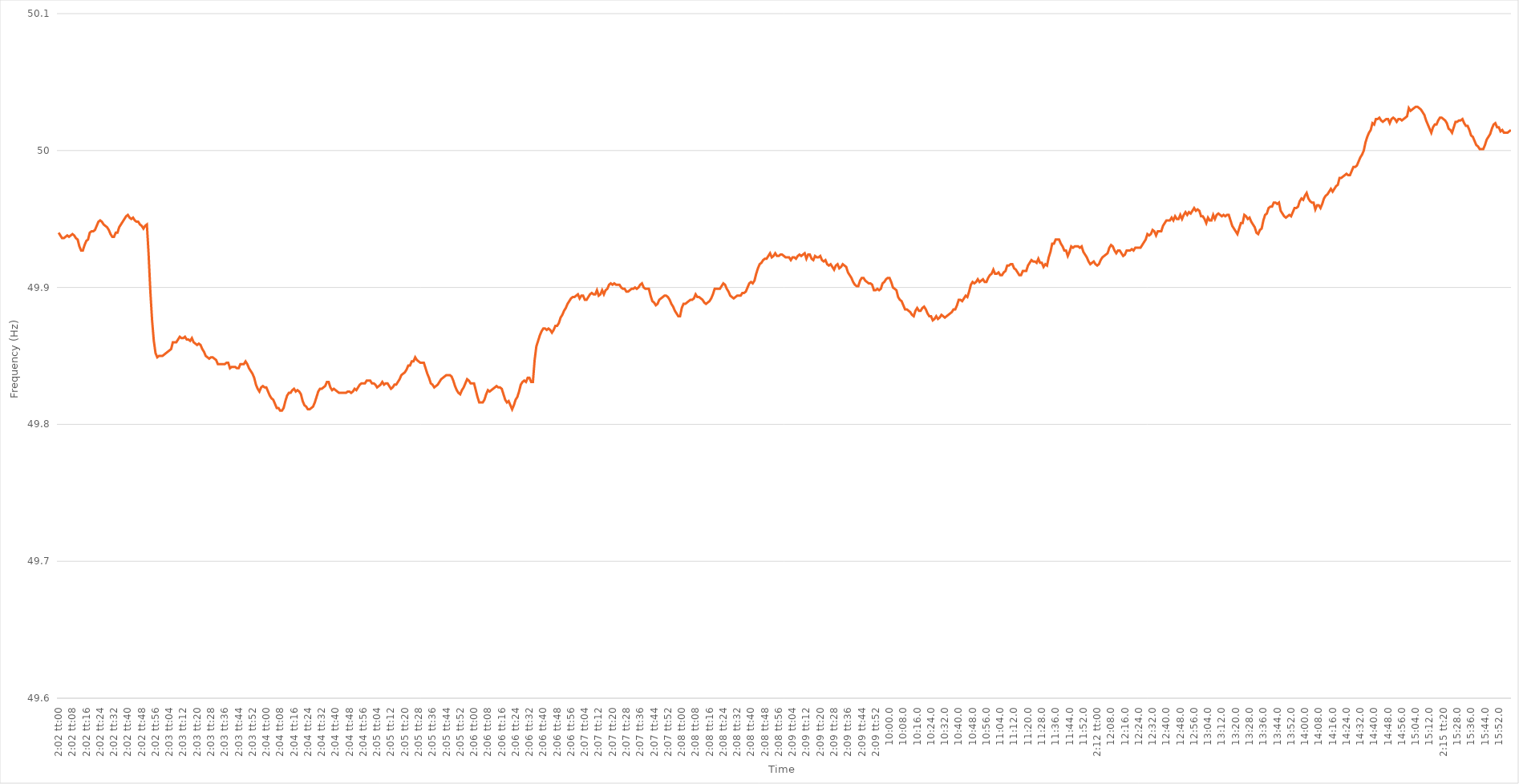
| Category | Series 0 |
|---|---|
| 0.08472222222222221 | 49.94 |
| 0.0847337962962963 | 49.938 |
| 0.08474537037037037 | 49.936 |
| 0.08475694444444444 | 49.936 |
| 0.08476851851851852 | 49.937 |
| 0.0847800925925926 | 49.938 |
| 0.08479166666666667 | 49.937 |
| 0.08480324074074075 | 49.938 |
| 0.0848148148148148 | 49.939 |
| 0.08482638888888888 | 49.938 |
| 0.08483796296296296 | 49.936 |
| 0.08484953703703703 | 49.935 |
| 0.08486111111111111 | 49.93 |
| 0.08487268518518519 | 49.927 |
| 0.08488425925925926 | 49.927 |
| 0.08489583333333334 | 49.931 |
| 0.08490740740740742 | 49.934 |
| 0.08491898148148148 | 49.935 |
| 0.08493055555555555 | 49.94 |
| 0.08494212962962962 | 49.941 |
| 0.0849537037037037 | 49.941 |
| 0.08496527777777778 | 49.942 |
| 0.08497685185185185 | 49.945 |
| 0.08498842592592593 | 49.948 |
| 0.085 | 49.949 |
| 0.08501157407407407 | 49.948 |
| 0.08502314814814815 | 49.946 |
| 0.08503472222222223 | 49.945 |
| 0.0850462962962963 | 49.944 |
| 0.08505787037037037 | 49.942 |
| 0.08506944444444443 | 49.939 |
| 0.08508101851851851 | 49.937 |
| 0.0850925925925926 | 49.937 |
| 0.08510416666666666 | 49.94 |
| 0.08511574074074074 | 49.94 |
| 0.08512731481481482 | 49.944 |
| 0.08513888888888889 | 49.946 |
| 0.08515046296296297 | 49.948 |
| 0.08516203703703705 | 49.95 |
| 0.0851736111111111 | 49.952 |
| 0.08518518518518518 | 49.953 |
| 0.08519675925925925 | 49.951 |
| 0.08520833333333333 | 49.95 |
| 0.08521990740740741 | 49.951 |
| 0.08523148148148148 | 49.949 |
| 0.08524305555555556 | 49.948 |
| 0.08525462962962964 | 49.948 |
| 0.0852662037037037 | 49.946 |
| 0.08527777777777779 | 49.945 |
| 0.08528935185185184 | 49.943 |
| 0.08530092592592592 | 49.945 |
| 0.0853125 | 49.946 |
| 0.08532407407407407 | 49.924 |
| 0.08533564814814815 | 49.897 |
| 0.08534722222222223 | 49.876 |
| 0.0853587962962963 | 49.861 |
| 0.08537037037037037 | 49.852 |
| 0.08538194444444445 | 49.849 |
| 0.08539351851851852 | 49.85 |
| 0.08540509259259259 | 49.85 |
| 0.08541666666666665 | 49.85 |
| 0.08542824074074074 | 49.851 |
| 0.08543981481481482 | 49.852 |
| 0.08545138888888888 | 49.853 |
| 0.08546296296296296 | 49.854 |
| 0.08547453703703704 | 49.855 |
| 0.08548611111111111 | 49.86 |
| 0.08549768518518519 | 49.86 |
| 0.08550925925925927 | 49.86 |
| 0.08552083333333334 | 49.862 |
| 0.0855324074074074 | 49.864 |
| 0.08554398148148147 | 49.863 |
| 0.08555555555555555 | 49.863 |
| 0.08556712962962963 | 49.864 |
| 0.0855787037037037 | 49.862 |
| 0.08559027777777778 | 49.862 |
| 0.08560185185185186 | 49.861 |
| 0.08561342592592593 | 49.863 |
| 0.085625 | 49.86 |
| 0.08563657407407409 | 49.859 |
| 0.08564814814814814 | 49.858 |
| 0.08565972222222222 | 49.859 |
| 0.08567129629629629 | 49.858 |
| 0.08568287037037037 | 49.855 |
| 0.08569444444444445 | 49.853 |
| 0.08570601851851851 | 49.85 |
| 0.0857175925925926 | 49.849 |
| 0.08572916666666668 | 49.848 |
| 0.08574074074074074 | 49.849 |
| 0.08575231481481482 | 49.849 |
| 0.08576388888888888 | 49.848 |
| 0.08577546296296296 | 49.847 |
| 0.08578703703703704 | 49.844 |
| 0.0857986111111111 | 49.844 |
| 0.08581018518518518 | 49.844 |
| 0.08582175925925926 | 49.844 |
| 0.08583333333333333 | 49.844 |
| 0.08584490740740741 | 49.845 |
| 0.08585648148148149 | 49.845 |
| 0.08586805555555556 | 49.841 |
| 0.08587962962962963 | 49.842 |
| 0.08589120370370369 | 49.842 |
| 0.08590277777777777 | 49.842 |
| 0.08591435185185185 | 49.841 |
| 0.08592592592592592 | 49.841 |
| 0.0859375 | 49.844 |
| 0.08594907407407408 | 49.844 |
| 0.08596064814814815 | 49.844 |
| 0.08597222222222223 | 49.846 |
| 0.08598379629629631 | 49.844 |
| 0.08599537037037037 | 49.841 |
| 0.08600694444444444 | 49.839 |
| 0.08601851851851851 | 49.837 |
| 0.08603009259259259 | 49.834 |
| 0.08604166666666667 | 49.829 |
| 0.08605324074074074 | 49.826 |
| 0.08606481481481482 | 49.824 |
| 0.0860763888888889 | 49.827 |
| 0.08608796296296296 | 49.828 |
| 0.08609953703703704 | 49.827 |
| 0.08611111111111112 | 49.827 |
| 0.08612268518518518 | 49.824 |
| 0.08613425925925926 | 49.821 |
| 0.08614583333333332 | 49.819 |
| 0.0861574074074074 | 49.818 |
| 0.08616898148148149 | 49.815 |
| 0.08618055555555555 | 49.812 |
| 0.08619212962962963 | 49.812 |
| 0.08620370370370371 | 49.81 |
| 0.08621527777777778 | 49.81 |
| 0.08622685185185186 | 49.812 |
| 0.08623842592592591 | 49.817 |
| 0.08625 | 49.821 |
| 0.08626157407407407 | 49.823 |
| 0.08627314814814814 | 49.823 |
| 0.08628472222222222 | 49.825 |
| 0.0862962962962963 | 49.826 |
| 0.08630787037037037 | 49.824 |
| 0.08631944444444445 | 49.825 |
| 0.08633101851851853 | 49.824 |
| 0.0863425925925926 | 49.822 |
| 0.08635416666666666 | 49.817 |
| 0.08636574074074073 | 49.814 |
| 0.08637731481481481 | 49.813 |
| 0.08638888888888889 | 49.811 |
| 0.08640046296296296 | 49.811 |
| 0.08641203703703704 | 49.812 |
| 0.08642361111111112 | 49.813 |
| 0.08643518518518518 | 49.816 |
| 0.08644675925925926 | 49.82 |
| 0.08645833333333335 | 49.824 |
| 0.08646990740740741 | 49.826 |
| 0.08648148148148148 | 49.826 |
| 0.08649305555555555 | 49.827 |
| 0.08650462962962963 | 49.828 |
| 0.0865162037037037 | 49.831 |
| 0.08652777777777777 | 49.831 |
| 0.08653935185185185 | 49.827 |
| 0.08655092592592593 | 49.825 |
| 0.0865625 | 49.826 |
| 0.08657407407407408 | 49.825 |
| 0.08658564814814816 | 49.824 |
| 0.08659722222222221 | 49.823 |
| 0.0866087962962963 | 49.823 |
| 0.08662037037037036 | 49.823 |
| 0.08663194444444444 | 49.823 |
| 0.08664351851851852 | 49.823 |
| 0.08665509259259259 | 49.824 |
| 0.08666666666666667 | 49.824 |
| 0.08667824074074075 | 49.823 |
| 0.08668981481481482 | 49.824 |
| 0.0867013888888889 | 49.826 |
| 0.08671296296296295 | 49.825 |
| 0.08672453703703703 | 49.827 |
| 0.08673611111111111 | 49.829 |
| 0.08674768518518518 | 49.83 |
| 0.08675925925925926 | 49.83 |
| 0.08677083333333334 | 49.83 |
| 0.0867824074074074 | 49.832 |
| 0.08679398148148149 | 49.832 |
| 0.08680555555555557 | 49.832 |
| 0.08681712962962963 | 49.83 |
| 0.0868287037037037 | 49.83 |
| 0.08684027777777777 | 49.829 |
| 0.08685185185185185 | 49.827 |
| 0.08686342592592593 | 49.828 |
| 0.086875 | 49.829 |
| 0.08688657407407407 | 49.831 |
| 0.08689814814814815 | 49.829 |
| 0.08690972222222222 | 49.83 |
| 0.0869212962962963 | 49.83 |
| 0.08693287037037038 | 49.828 |
| 0.08694444444444445 | 49.826 |
| 0.08695601851851852 | 49.827 |
| 0.08696759259259258 | 49.829 |
| 0.08697916666666666 | 49.829 |
| 0.08699074074074074 | 49.831 |
| 0.08700231481481481 | 49.833 |
| 0.08701388888888889 | 49.836 |
| 0.08702546296296297 | 49.837 |
| 0.08703703703703704 | 49.838 |
| 0.08704861111111112 | 49.84 |
| 0.08706018518518517 | 49.843 |
| 0.08707175925925925 | 49.843 |
| 0.08708333333333333 | 49.846 |
| 0.0870949074074074 | 49.846 |
| 0.08710648148148148 | 49.849 |
| 0.08711805555555556 | 49.847 |
| 0.08712962962962963 | 49.846 |
| 0.0871412037037037 | 49.845 |
| 0.08715277777777779 | 49.845 |
| 0.08716435185185185 | 49.845 |
| 0.08717592592592593 | 49.841 |
| 0.08718749999999999 | 49.837 |
| 0.08719907407407407 | 49.834 |
| 0.08721064814814815 | 49.83 |
| 0.08722222222222221 | 49.829 |
| 0.0872337962962963 | 49.827 |
| 0.08724537037037038 | 49.828 |
| 0.08725694444444444 | 49.829 |
| 0.08726851851851852 | 49.831 |
| 0.0872800925925926 | 49.833 |
| 0.08729166666666667 | 49.834 |
| 0.08730324074074074 | 49.835 |
| 0.0873148148148148 | 49.836 |
| 0.08732638888888888 | 49.836 |
| 0.08733796296296296 | 49.836 |
| 0.08734953703703703 | 49.835 |
| 0.08736111111111111 | 49.832 |
| 0.08737268518518519 | 49.828 |
| 0.08738425925925926 | 49.825 |
| 0.08739583333333334 | 49.823 |
| 0.08740740740740742 | 49.822 |
| 0.08741898148148147 | 49.825 |
| 0.08743055555555555 | 49.827 |
| 0.08744212962962962 | 49.83 |
| 0.0874537037037037 | 49.833 |
| 0.08746527777777778 | 49.832 |
| 0.08747685185185185 | 49.83 |
| 0.08748842592592593 | 49.83 |
| 0.08750000000000001 | 49.83 |
| 0.08751157407407407 | 49.825 |
| 0.08752314814814816 | 49.82 |
| 0.08753472222222221 | 49.816 |
| 0.08754629629629629 | 49.816 |
| 0.08755787037037037 | 49.816 |
| 0.08756944444444444 | 49.818 |
| 0.08758101851851852 | 49.822 |
| 0.0875925925925926 | 49.825 |
| 0.08760416666666666 | 49.824 |
| 0.08761574074074074 | 49.825 |
| 0.08762731481481482 | 49.826 |
| 0.08763888888888889 | 49.827 |
| 0.08765046296296297 | 49.828 |
| 0.08766203703703702 | 49.827 |
| 0.0876736111111111 | 49.827 |
| 0.08768518518518519 | 49.826 |
| 0.08769675925925925 | 49.822 |
| 0.08770833333333333 | 49.818 |
| 0.08771990740740741 | 49.816 |
| 0.08773148148148148 | 49.817 |
| 0.08774305555555556 | 49.814 |
| 0.08775462962962964 | 49.811 |
| 0.08776620370370371 | 49.814 |
| 0.08777777777777777 | 49.818 |
| 0.08778935185185184 | 49.82 |
| 0.08780092592592592 | 49.824 |
| 0.0878125 | 49.829 |
| 0.08782407407407407 | 49.831 |
| 0.08783564814814815 | 49.832 |
| 0.08784722222222223 | 49.831 |
| 0.0878587962962963 | 49.834 |
| 0.08787037037037038 | 49.834 |
| 0.08788194444444446 | 49.831 |
| 0.08789351851851851 | 49.831 |
| 0.08790509259259259 | 49.847 |
| 0.08791666666666666 | 49.857 |
| 0.08792824074074074 | 49.861 |
| 0.08793981481481482 | 49.865 |
| 0.08795138888888888 | 49.868 |
| 0.08796296296296297 | 49.87 |
| 0.08797453703703705 | 49.87 |
| 0.08798611111111111 | 49.869 |
| 0.08799768518518519 | 49.87 |
| 0.08800925925925925 | 49.869 |
| 0.08802083333333333 | 49.867 |
| 0.0880324074074074 | 49.869 |
| 0.08804398148148147 | 49.872 |
| 0.08805555555555555 | 49.872 |
| 0.08806712962962963 | 49.874 |
| 0.0880787037037037 | 49.878 |
| 0.08809027777777778 | 49.88 |
| 0.08810185185185186 | 49.883 |
| 0.08811342592592593 | 49.885 |
| 0.08812500000000001 | 49.888 |
| 0.08813657407407406 | 49.89 |
| 0.08814814814814814 | 49.892 |
| 0.08815972222222222 | 49.893 |
| 0.08817129629629629 | 49.893 |
| 0.08818287037037037 | 49.894 |
| 0.08819444444444445 | 49.895 |
| 0.08820601851851852 | 49.892 |
| 0.0882175925925926 | 49.894 |
| 0.08822916666666668 | 49.894 |
| 0.08824074074074074 | 49.891 |
| 0.08825231481481481 | 49.891 |
| 0.08826388888888888 | 49.893 |
| 0.08827546296296296 | 49.895 |
| 0.08828703703703704 | 49.896 |
| 0.0882986111111111 | 49.895 |
| 0.08831018518518519 | 49.895 |
| 0.08832175925925927 | 49.898 |
| 0.08833333333333333 | 49.894 |
| 0.08834490740740741 | 49.895 |
| 0.0883564814814815 | 49.898 |
| 0.08836805555555555 | 49.895 |
| 0.08837962962962963 | 49.898 |
| 0.0883912037037037 | 49.899 |
| 0.08840277777777777 | 49.902 |
| 0.08841435185185186 | 49.903 |
| 0.08842592592592592 | 49.902 |
| 0.0884375 | 49.903 |
| 0.08844907407407408 | 49.902 |
| 0.08846064814814815 | 49.902 |
| 0.08847222222222223 | 49.902 |
| 0.08848379629629628 | 49.9 |
| 0.08849537037037036 | 49.899 |
| 0.08850694444444444 | 49.899 |
| 0.08851851851851851 | 49.897 |
| 0.08853009259259259 | 49.897 |
| 0.08854166666666667 | 49.898 |
| 0.08855324074074074 | 49.899 |
| 0.08856481481481482 | 49.899 |
| 0.0885763888888889 | 49.9 |
| 0.08858796296296297 | 49.899 |
| 0.08859953703703705 | 49.9 |
| 0.0886111111111111 | 49.902 |
| 0.08862268518518518 | 49.903 |
| 0.08863425925925926 | 49.9 |
| 0.08864583333333333 | 49.899 |
| 0.08865740740740741 | 49.899 |
| 0.08866898148148149 | 49.899 |
| 0.08868055555555555 | 49.894 |
| 0.08869212962962963 | 49.89 |
| 0.08870370370370372 | 49.889 |
| 0.08871527777777778 | 49.887 |
| 0.08872685185185185 | 49.888 |
| 0.08873842592592592 | 49.891 |
| 0.08875 | 49.892 |
| 0.08876157407407408 | 49.893 |
| 0.08877314814814814 | 49.894 |
| 0.08878472222222222 | 49.894 |
| 0.0887962962962963 | 49.893 |
| 0.08880787037037037 | 49.891 |
| 0.08881944444444445 | 49.888 |
| 0.08883101851851853 | 49.886 |
| 0.08884259259259258 | 49.883 |
| 0.08885416666666666 | 49.881 |
| 0.08886574074074073 | 49.879 |
| 0.08887731481481481 | 49.879 |
| 0.08888888888888889 | 49.885 |
| 0.08890046296296296 | 49.888 |
| 0.08891203703703704 | 49.888 |
| 0.08892361111111112 | 49.889 |
| 0.08893518518518519 | 49.89 |
| 0.08894675925925927 | 49.891 |
| 0.08895833333333332 | 49.891 |
| 0.0889699074074074 | 49.892 |
| 0.08898148148148148 | 49.895 |
| 0.08899305555555555 | 49.893 |
| 0.08900462962962963 | 49.893 |
| 0.08901620370370371 | 49.892 |
| 0.08902777777777778 | 49.891 |
| 0.08903935185185186 | 49.889 |
| 0.08905092592592594 | 49.888 |
| 0.0890625 | 49.889 |
| 0.08907407407407408 | 49.89 |
| 0.08908564814814814 | 49.892 |
| 0.08909722222222222 | 49.895 |
| 0.0891087962962963 | 49.899 |
| 0.08912037037037036 | 49.899 |
| 0.08913194444444444 | 49.899 |
| 0.08914351851851852 | 49.899 |
| 0.08915509259259259 | 49.901 |
| 0.08916666666666667 | 49.903 |
| 0.08917824074074075 | 49.902 |
| 0.08918981481481482 | 49.899 |
| 0.08920138888888889 | 49.897 |
| 0.08921296296296295 | 49.894 |
| 0.08922453703703703 | 49.893 |
| 0.08923611111111111 | 49.892 |
| 0.08924768518518518 | 49.893 |
| 0.08925925925925926 | 49.894 |
| 0.08927083333333334 | 49.894 |
| 0.08928240740740741 | 49.894 |
| 0.08929398148148149 | 49.896 |
| 0.08930555555555557 | 49.896 |
| 0.08931712962962962 | 49.897 |
| 0.0893287037037037 | 49.9 |
| 0.08934027777777777 | 49.903 |
| 0.08935185185185185 | 49.904 |
| 0.08936342592592593 | 49.903 |
| 0.089375 | 49.905 |
| 0.08938657407407408 | 49.91 |
| 0.08939814814814816 | 49.914 |
| 0.08940972222222222 | 49.917 |
| 0.0894212962962963 | 49.918 |
| 0.08943287037037036 | 49.92 |
| 0.08944444444444444 | 49.921 |
| 0.08945601851851852 | 49.921 |
| 0.08946759259259258 | 49.923 |
| 0.08947916666666667 | 49.925 |
| 0.08949074074074075 | 49.922 |
| 0.08950231481481481 | 49.923 |
| 0.08951388888888889 | 49.925 |
| 0.08952546296296297 | 49.923 |
| 0.08953703703703704 | 49.923 |
| 0.0895486111111111 | 49.924 |
| 0.08956018518518517 | 49.924 |
| 0.08957175925925925 | 49.923 |
| 0.08958333333333333 | 49.922 |
| 0.0895949074074074 | 49.922 |
| 0.08960648148148148 | 49.922 |
| 0.08961805555555556 | 49.92 |
| 0.08962962962962963 | 49.922 |
| 0.08964120370370371 | 49.922 |
| 0.08965277777777779 | 49.921 |
| 0.08966435185185186 | 49.923 |
| 0.08967592592592592 | 49.924 |
| 0.08968749999999999 | 49.923 |
| 0.08969907407407407 | 49.924 |
| 0.08971064814814815 | 49.925 |
| 0.08972222222222222 | 49.921 |
| 0.0897337962962963 | 49.924 |
| 0.08974537037037038 | 49.924 |
| 0.08975694444444444 | 49.921 |
| 0.08976851851851853 | 49.92 |
| 0.0897800925925926 | 49.923 |
| 0.08979166666666666 | 49.922 |
| 0.08980324074074074 | 49.922 |
| 0.0898148148148148 | 49.923 |
| 0.08982638888888889 | 49.92 |
| 0.08983796296296297 | 49.919 |
| 0.08984953703703703 | 49.92 |
| 0.08986111111111111 | 49.917 |
| 0.0898726851851852 | 49.916 |
| 0.08988425925925926 | 49.917 |
| 0.08989583333333334 | 49.915 |
| 0.0899074074074074 | 49.913 |
| 0.08991898148148147 | 49.916 |
| 0.08993055555555556 | 49.917 |
| 0.08994212962962962 | 49.914 |
| 0.0899537037037037 | 49.915 |
| 0.08996527777777778 | 49.917 |
| 0.08997685185185185 | 49.916 |
| 0.08998842592592593 | 49.915 |
| 0.09000000000000001 | 49.911 |
| 0.09001157407407408 | 49.909 |
| 0.09002314814814814 | 49.907 |
| 0.09003472222222221 | 49.904 |
| 0.09004629629629629 | 49.902 |
| 0.09005787037037037 | 49.901 |
| 0.09006944444444444 | 49.901 |
| 0.09008101851851852 | 49.905 |
| 0.0900925925925926 | 49.907 |
| 0.09010416666666667 | 49.907 |
| 0.09011574074074075 | 49.905 |
| 0.09012731481481483 | 49.904 |
| 0.0901388888888889 | 49.903 |
| 0.09015046296296296 | 49.903 |
| 0.09016203703703703 | 49.902 |
| 0.09017361111111111 | 49.898 |
| 0.09018518518518519 | 49.898 |
| 0.09019675925925925 | 49.899 |
| 0.09020833333333333 | 49.898 |
| 0.09021990740740742 | 49.899 |
| 0.09023148148148148 | 49.903 |
| 0.09024305555555556 | 49.904 |
| 0.09025462962962964 | 49.906 |
| 0.0902662037037037 | 49.907 |
| 0.09027777777777778 | 49.907 |
| 0.09028935185185184 | 49.904 |
| 0.09030092592592592 | 49.9 |
| 0.0903125 | 49.899 |
| 0.09032407407407407 | 49.898 |
| 0.09033564814814815 | 49.893 |
| 0.09034722222222223 | 49.891 |
| 0.0903587962962963 | 49.89 |
| 0.09037037037037038 | 49.887 |
| 0.09038194444444443 | 49.884 |
| 0.09039351851851851 | 49.884 |
| 0.09040509259259259 | 49.883 |
| 0.09041666666666666 | 49.882 |
| 0.09042824074074074 | 49.88 |
| 0.09043981481481482 | 49.879 |
| 0.09045138888888889 | 49.883 |
| 0.09046296296296297 | 49.885 |
| 0.09047453703703705 | 49.883 |
| 0.09048611111111111 | 49.883 |
| 0.09049768518518518 | 49.885 |
| 0.09050925925925925 | 49.886 |
| 0.09052083333333333 | 49.884 |
| 0.09053240740740741 | 49.881 |
| 0.09054398148148148 | 49.879 |
| 0.09055555555555556 | 49.879 |
| 0.09056712962962964 | 49.876 |
| 0.0905787037037037 | 49.877 |
| 0.09059027777777778 | 49.879 |
| 0.09060185185185186 | 49.877 |
| 0.09061342592592592 | 49.878 |
| 0.090625 | 49.88 |
| 0.09063657407407406 | 49.879 |
| 0.09064814814814814 | 49.878 |
| 0.09065972222222222 | 49.879 |
| 0.09067129629629629 | 49.88 |
| 0.09068287037037037 | 49.881 |
| 0.09069444444444445 | 49.882 |
| 0.09070601851851852 | 49.884 |
| 0.0907175925925926 | 49.884 |
| 0.09072916666666668 | 49.887 |
| 0.09074074074074073 | 49.891 |
| 0.09075231481481481 | 49.891 |
| 0.09076388888888888 | 49.89 |
| 0.09077546296296296 | 49.892 |
| 0.09078703703703704 | 49.894 |
| 0.09079861111111111 | 49.893 |
| 0.09081018518518519 | 49.897 |
| 0.09082175925925927 | 49.902 |
| 0.09083333333333334 | 49.904 |
| 0.09084490740740742 | 49.903 |
| 0.09085648148148147 | 49.904 |
| 0.09086805555555555 | 49.906 |
| 0.09087962962962963 | 49.904 |
| 0.0908912037037037 | 49.905 |
| 0.09090277777777778 | 49.906 |
| 0.09091435185185186 | 49.904 |
| 0.09092592592592592 | 49.904 |
| 0.0909375 | 49.907 |
| 0.09094907407407408 | 49.909 |
| 0.09096064814814815 | 49.91 |
| 0.09097222222222222 | 49.913 |
| 0.09098379629629628 | 49.91 |
| 0.09099537037037037 | 49.91 |
| 0.09100694444444445 | 49.911 |
| 0.09101851851851851 | 49.909 |
| 0.09103009259259259 | 49.909 |
| 0.09104166666666667 | 49.911 |
| 0.09105324074074074 | 49.912 |
| 0.09106481481481482 | 49.916 |
| 0.0910763888888889 | 49.916 |
| 0.09108796296296295 | 49.917 |
| 0.09109953703703703 | 49.917 |
| 0.0911111111111111 | 49.914 |
| 0.09112268518518518 | 49.913 |
| 0.09113425925925926 | 49.911 |
| 0.09114583333333333 | 49.909 |
| 0.09115740740740741 | 49.909 |
| 0.09116898148148149 | 49.912 |
| 0.09118055555555556 | 49.912 |
| 0.09119212962962964 | 49.912 |
| 0.09120370370370372 | 49.916 |
| 0.09121527777777777 | 49.918 |
| 0.09122685185185185 | 49.92 |
| 0.09123842592592592 | 49.919 |
| 0.09125 | 49.919 |
| 0.09126157407407408 | 49.918 |
| 0.09127314814814814 | 49.921 |
| 0.09128472222222223 | 49.918 |
| 0.0912962962962963 | 49.918 |
| 0.09130787037037037 | 49.915 |
| 0.09131944444444445 | 49.917 |
| 0.0913310185185185 | 49.916 |
| 0.09134259259259259 | 49.922 |
| 0.09135416666666667 | 49.926 |
| 0.09136574074074073 | 49.932 |
| 0.09137731481481481 | 49.932 |
| 0.0913888888888889 | 49.935 |
| 0.09140046296296296 | 49.935 |
| 0.09141203703703704 | 49.935 |
| 0.09142361111111112 | 49.932 |
| 0.09143518518518519 | 49.93 |
| 0.09144675925925926 | 49.927 |
| 0.09145833333333332 | 49.927 |
| 0.0914699074074074 | 49.923 |
| 0.09148148148148148 | 49.926 |
| 0.09149305555555555 | 49.93 |
| 0.09150462962962963 | 49.929 |
| 0.09151620370370371 | 49.93 |
| 0.09152777777777778 | 49.93 |
| 0.09153935185185186 | 49.93 |
| 0.09155092592592594 | 49.929 |
| 0.09156249999999999 | 49.93 |
| 0.09157407407407407 | 49.926 |
| 0.09158564814814814 | 49.924 |
| 0.09159722222222222 | 49.922 |
| 0.0916087962962963 | 49.919 |
| 0.09162037037037037 | 49.917 |
| 0.09163194444444445 | 49.918 |
| 0.09164351851851853 | 49.919 |
| 0.0916550925925926 | 49.917 |
| 0.09166666666666667 | 49.916 |
| 0.09167824074074075 | 49.917 |
| 0.09168981481481481 | 49.92 |
| 0.09170138888888889 | 49.922 |
| 0.09171296296296295 | 49.923 |
| 0.09172453703703703 | 49.924 |
| 0.09173611111111112 | 49.925 |
| 0.09174768518518518 | 49.929 |
| 0.09175925925925926 | 49.931 |
| 0.09177083333333334 | 49.93 |
| 0.09178240740740741 | 49.927 |
| 0.09179398148148149 | 49.925 |
| 0.09180555555555554 | 49.927 |
| 0.09181712962962962 | 49.927 |
| 0.0918287037037037 | 49.925 |
| 0.09184027777777777 | 49.923 |
| 0.09185185185185185 | 49.924 |
| 0.09186342592592593 | 49.927 |
| 0.091875 | 49.927 |
| 0.09188657407407408 | 49.927 |
| 0.09189814814814816 | 49.928 |
| 0.09190972222222223 | 49.927 |
| 0.09192129629629629 | 49.929 |
| 0.09193287037037036 | 49.929 |
| 0.09194444444444444 | 49.929 |
| 0.09195601851851852 | 49.929 |
| 0.09196759259259259 | 49.931 |
| 0.09197916666666667 | 49.933 |
| 0.09199074074074075 | 49.935 |
| 0.09200231481481481 | 49.939 |
| 0.0920138888888889 | 49.938 |
| 0.09202546296296298 | 49.939 |
| 0.09203703703703703 | 49.942 |
| 0.09204861111111111 | 49.941 |
| 0.09206018518518518 | 49.938 |
| 0.09207175925925926 | 49.941 |
| 0.09208333333333334 | 49.941 |
| 0.0920949074074074 | 49.941 |
| 0.09210648148148148 | 49.945 |
| 0.09211805555555556 | 49.947 |
| 0.09212962962962963 | 49.949 |
| 0.09214120370370371 | 49.949 |
| 0.09215277777777776 | 49.949 |
| 0.09216435185185184 | 49.951 |
| 0.09217592592592593 | 49.949 |
| 0.09218749999999999 | 49.952 |
| 0.09219907407407407 | 49.95 |
| 0.09221064814814815 | 49.95 |
| 0.09222222222222222 | 49.953 |
| 0.0922337962962963 | 49.95 |
| 0.09224537037037038 | 49.953 |
| 0.09225694444444445 | 49.955 |
| 0.09226851851851853 | 49.953 |
| 0.09228009259259258 | 49.955 |
| 0.09229166666666666 | 49.954 |
| 0.09230324074074074 | 49.956 |
| 0.09231481481481481 | 49.958 |
| 0.09232638888888889 | 49.956 |
| 0.09233796296296297 | 49.957 |
| 0.09234953703703704 | 49.956 |
| 0.09236111111111112 | 49.952 |
| 0.0923726851851852 | 49.952 |
| 0.09238425925925926 | 49.95 |
| 0.09239583333333333 | 49.947 |
| 0.0924074074074074 | 49.951 |
| 0.09241898148148148 | 49.949 |
| 0.09243055555555556 | 49.949 |
| 0.09244212962962962 | 49.953 |
| 0.0924537037037037 | 49.95 |
| 0.09246527777777779 | 49.953 |
| 0.09247685185185185 | 49.954 |
| 0.09248842592592593 | 49.953 |
| 0.09250000000000001 | 49.952 |
| 0.09251157407407407 | 49.953 |
| 0.09252314814814815 | 49.952 |
| 0.09253472222222221 | 49.953 |
| 0.0925462962962963 | 49.953 |
| 0.09255787037037037 | 49.949 |
| 0.09256944444444444 | 49.945 |
| 0.09258101851851852 | 49.943 |
| 0.0925925925925926 | 49.941 |
| 0.09260416666666667 | 49.939 |
| 0.09261574074074075 | 49.943 |
| 0.0926273148148148 | 49.947 |
| 0.09263888888888888 | 49.947 |
| 0.09265046296296296 | 49.953 |
| 0.09266203703703703 | 49.952 |
| 0.09267361111111111 | 49.95 |
| 0.09268518518518519 | 49.951 |
| 0.09269675925925926 | 49.948 |
| 0.09270833333333334 | 49.946 |
| 0.09271990740740742 | 49.944 |
| 0.09273148148148148 | 49.94 |
| 0.09274305555555556 | 49.939 |
| 0.09275462962962962 | 49.942 |
| 0.0927662037037037 | 49.943 |
| 0.09277777777777778 | 49.949 |
| 0.09278935185185185 | 49.953 |
| 0.09280092592592593 | 49.954 |
| 0.0928125 | 49.958 |
| 0.09282407407407407 | 49.959 |
| 0.09283564814814815 | 49.959 |
| 0.09284722222222223 | 49.962 |
| 0.0928587962962963 | 49.962 |
| 0.09287037037037037 | 49.961 |
| 0.09288194444444443 | 49.962 |
| 0.09289351851851851 | 49.956 |
| 0.0929050925925926 | 49.954 |
| 0.09291666666666666 | 49.952 |
| 0.09292824074074074 | 49.951 |
| 0.09293981481481482 | 49.952 |
| 0.09295138888888889 | 49.953 |
| 0.09296296296296297 | 49.952 |
| 0.09297453703703705 | 49.955 |
| 0.0929861111111111 | 49.958 |
| 0.09299768518518518 | 49.958 |
| 0.09300925925925925 | 49.959 |
| 0.09302083333333333 | 49.963 |
| 0.09303240740740741 | 49.965 |
| 0.09304398148148148 | 49.964 |
| 0.09305555555555556 | 49.967 |
| 0.09306712962962964 | 49.969 |
| 0.0930787037037037 | 49.965 |
| 0.09309027777777779 | 49.963 |
| 0.09310185185185184 | 49.962 |
| 0.09311342592592592 | 49.962 |
| 0.093125 | 49.957 |
| 0.09313657407407407 | 49.96 |
| 0.09314814814814815 | 49.96 |
| 0.09315972222222223 | 49.958 |
| 0.0931712962962963 | 49.961 |
| 0.09318287037037037 | 49.965 |
| 0.09319444444444445 | 49.967 |
| 0.09320601851851852 | 49.968 |
| 0.09321759259259259 | 49.97 |
| 0.09322916666666665 | 49.972 |
| 0.09324074074074074 | 49.97 |
| 0.09325231481481482 | 49.972 |
| 0.09326388888888888 | 49.974 |
| 0.09327546296296296 | 49.975 |
| 0.09328703703703704 | 49.98 |
| 0.09329861111111111 | 49.98 |
| 0.09331018518518519 | 49.981 |
| 0.09332175925925927 | 49.982 |
| 0.09333333333333334 | 49.983 |
| 0.0933449074074074 | 49.982 |
| 0.09335648148148147 | 49.982 |
| 0.09336805555555555 | 49.985 |
| 0.09337962962962963 | 49.988 |
| 0.0933912037037037 | 49.988 |
| 0.09340277777777778 | 49.989 |
| 0.09341435185185186 | 49.992 |
| 0.09342592592592593 | 49.995 |
| 0.0934375 | 49.997 |
| 0.09344907407407409 | 50 |
| 0.09346064814814814 | 50.006 |
| 0.09347222222222222 | 50.01 |
| 0.09348379629629629 | 50.013 |
| 0.09349537037037037 | 50.015 |
| 0.09350694444444445 | 50.02 |
| 0.09351851851851851 | 50.019 |
| 0.0935300925925926 | 50.023 |
| 0.09354166666666668 | 50.023 |
| 0.09355324074074074 | 50.024 |
| 0.09356481481481482 | 50.022 |
| 0.09357638888888888 | 50.021 |
| 0.09358796296296296 | 50.022 |
| 0.09359953703703704 | 50.023 |
| 0.0936111111111111 | 50.023 |
| 0.09362268518518518 | 50.02 |
| 0.09363425925925926 | 50.023 |
| 0.09364583333333333 | 50.024 |
| 0.09365740740740741 | 50.023 |
| 0.09366898148148149 | 50.021 |
| 0.09368055555555556 | 50.023 |
| 0.09369212962962963 | 50.023 |
| 0.09370370370370369 | 50.022 |
| 0.09371527777777777 | 50.023 |
| 0.09372685185185185 | 50.024 |
| 0.09373842592592592 | 50.025 |
| 0.09375 | 50.031 |
| 0.09376157407407408 | 50.029 |
| 0.09377314814814815 | 50.03 |
| 0.09378472222222223 | 50.031 |
| 0.09379629629629631 | 50.032 |
| 0.09380787037037037 | 50.032 |
| 0.09381944444444444 | 50.031 |
| 0.09383101851851851 | 50.03 |
| 0.09384259259259259 | 50.028 |
| 0.09385416666666667 | 50.026 |
| 0.09386574074074074 | 50.022 |
| 0.09387731481481482 | 50.019 |
| 0.0938888888888889 | 50.016 |
| 0.09390046296296296 | 50.013 |
| 0.09391203703703704 | 50.017 |
| 0.0939236111111111 | 50.019 |
| 0.09393518518518518 | 50.019 |
| 0.09394675925925926 | 50.022 |
| 0.09395833333333332 | 50.024 |
| 0.0939699074074074 | 50.024 |
| 0.09398148148148149 | 50.023 |
| 0.09399305555555555 | 50.022 |
| 0.09400462962962963 | 50.02 |
| 0.09401620370370371 | 50.016 |
| 0.09402777777777778 | 50.015 |
| 0.09403935185185186 | 50.013 |
| 0.09405092592592594 | 50.017 |
| 0.0940625 | 50.021 |
| 0.09407407407407407 | 50.021 |
| 0.09408564814814814 | 50.022 |
| 0.09409722222222222 | 50.022 |
| 0.0941087962962963 | 50.023 |
| 0.09412037037037037 | 50.02 |
| 0.09413194444444445 | 50.018 |
| 0.09414351851851853 | 50.018 |
| 0.0941550925925926 | 50.015 |
| 0.09416666666666666 | 50.011 |
| 0.09417824074074073 | 50.01 |
| 0.09418981481481481 | 50.007 |
| 0.09420138888888889 | 50.004 |
| 0.09421296296296296 | 50.003 |
| 0.09422453703703704 | 50.001 |
| 0.09423611111111112 | 50.001 |
| 0.09424768518518518 | 50.001 |
| 0.09425925925925926 | 50.004 |
| 0.09427083333333335 | 50.008 |
| 0.09428240740740741 | 50.01 |
| 0.09429398148148148 | 50.012 |
| 0.09430555555555555 | 50.016 |
| 0.09431712962962963 | 50.019 |
| 0.0943287037037037 | 50.02 |
| 0.09434027777777777 | 50.017 |
| 0.09435185185185185 | 50.017 |
| 0.09436342592592593 | 50.014 |
| 0.094375 | 50.015 |
| 0.09438657407407408 | 50.013 |
| 0.09439814814814813 | 50.013 |
| 0.09440972222222221 | 50.013 |
| 0.0944212962962963 | 50.014 |
| 0.09443287037037036 | 50.015 |